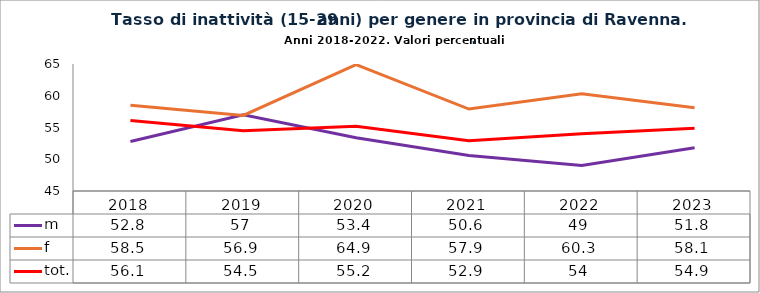
| Category | m | f | tot. |
|---|---|---|---|
| 2018.0 | 52.8 | 58.5 | 56.1 |
| 2019.0 | 57 | 56.9 | 54.5 |
| 2020.0 | 53.4 | 64.9 | 55.2 |
| 2021.0 | 50.6 | 57.9 | 52.9 |
| 2022.0 | 49 | 60.3 | 54 |
| 2023.0 | 51.8 | 58.1 | 54.9 |